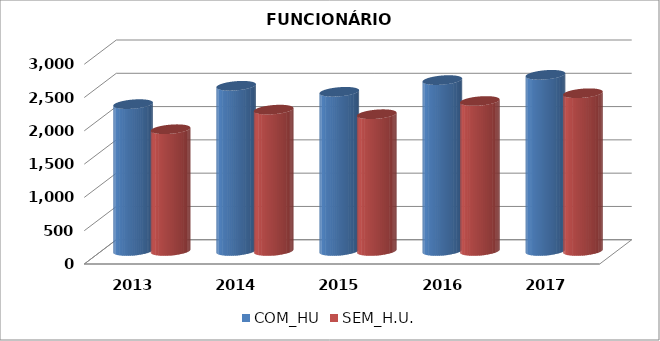
| Category | COM_HU | SEM_H.U. |
|---|---|---|
| 2013.0 | 2206.05 | 1828.95 |
| 2014.0 | 2481.35 | 2123.25 |
| 2015.0 | 2391 | 2054.5 |
| 2016.0 | 2567 | 2253 |
| 2017.0 | 2646.2 | 2369.5 |